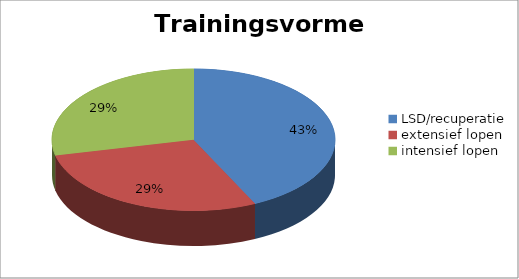
| Category | Series 0 |
|---|---|
| LSD/recuperatie | 90 |
| extensief lopen | 60 |
| intensief lopen | 60 |